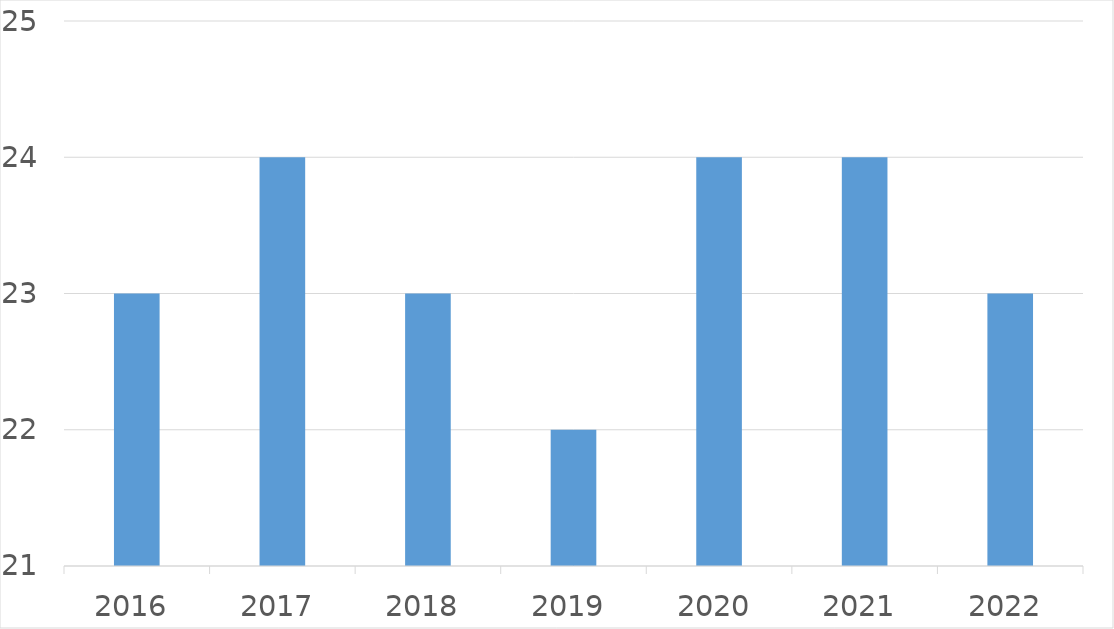
| Category | Series 0 |
|---|---|
| 2016 | 23 |
| 2017 | 24 |
| 2018 | 23 |
| 2019 | 22 |
| 2020 | 24 |
| 2021 | 24 |
| 2022 | 23 |